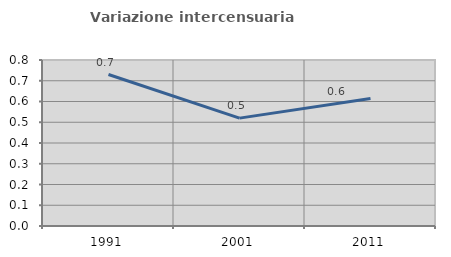
| Category | Variazione intercensuaria annua |
|---|---|
| 1991.0 | 0.73 |
| 2001.0 | 0.52 |
| 2011.0 | 0.614 |